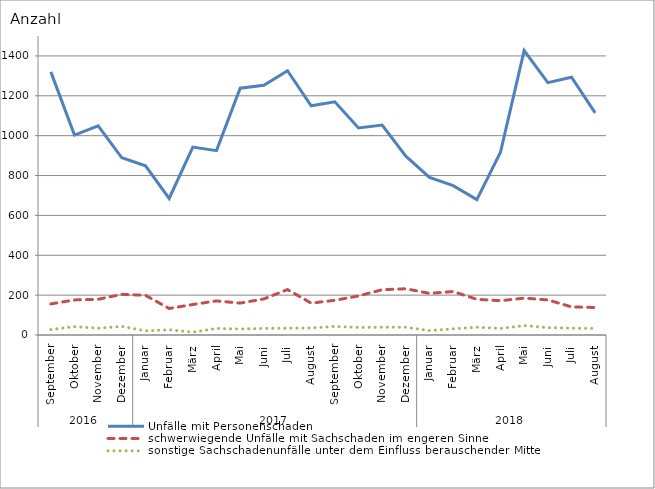
| Category | Unfälle mit Personenschaden | schwerwiegende Unfälle mit Sachschaden im engeren Sinne | sonstige Sachschadenunfälle unter dem Einfluss berauschender Mittel |
|---|---|---|---|
| 0 | 1320 | 156 | 27 |
| 1 | 1003 | 176 | 42 |
| 2 | 1049 | 179 | 34 |
| 3 | 889 | 204 | 43 |
| 4 | 849 | 199 | 21 |
| 5 | 685 | 133 | 26 |
| 6 | 943 | 153 | 14 |
| 7 | 925 | 171 | 33 |
| 8 | 1238 | 160 | 30 |
| 9 | 1253 | 181 | 33 |
| 10 | 1326 | 228 | 34 |
| 11 | 1150 | 160 | 35 |
| 12 | 1170 | 174 | 43 |
| 13 | 1039 | 196 | 38 |
| 14 | 1053 | 227 | 39 |
| 15 | 897 | 232 | 39 |
| 16 | 791 | 209 | 22 |
| 17 | 749 | 218 | 31 |
| 18 | 679 | 179 | 39 |
| 19 | 917 | 172 | 33 |
| 20 | 1427 | 185 | 47 |
| 21 | 1266 | 176 | 37 |
| 22 | 1293 | 141 | 34 |
| 23 | 1114 | 138 | 33 |